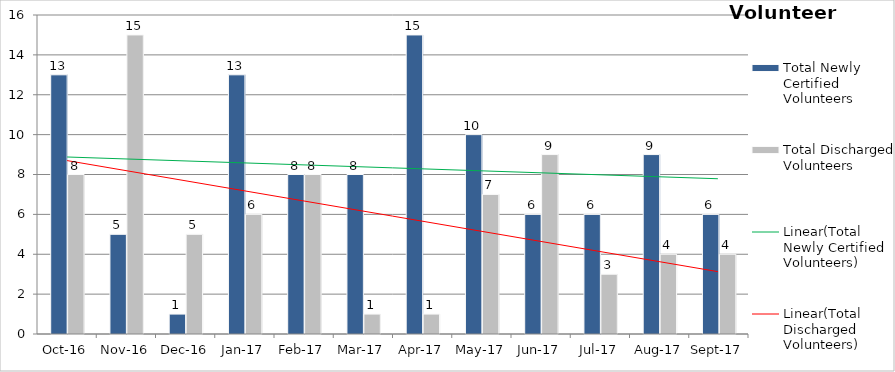
| Category | Total Newly Certified Volunteers | Total Discharged Volunteers |
|---|---|---|
| 2016-10-01 | 13 | 8 |
| 2016-11-01 | 5 | 15 |
| 2016-12-01 | 1 | 5 |
| 2017-01-01 | 13 | 6 |
| 2017-02-01 | 8 | 8 |
| 2017-03-01 | 8 | 1 |
| 2017-04-01 | 15 | 1 |
| 2017-05-01 | 10 | 7 |
| 2017-06-01 | 6 | 9 |
| 2017-07-01 | 6 | 3 |
| 2017-08-01 | 9 | 4 |
| 2017-09-01 | 6 | 4 |